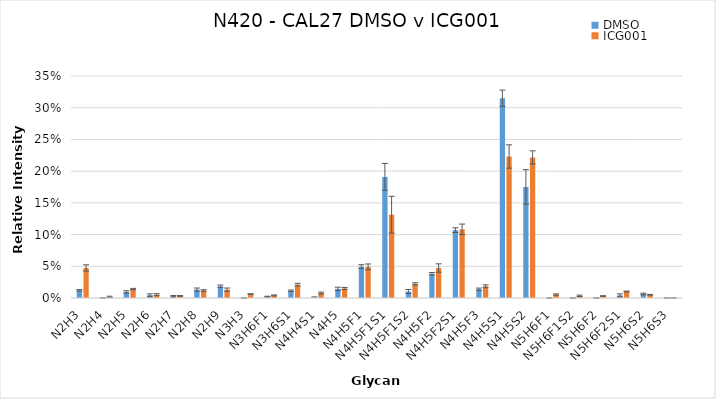
| Category | DMSO | ICG001 |
|---|---|---|
| N2H3 | 0.012 | 0.047 |
| N2H4 | 0 | 0.002 |
| N2H5 | 0.01 | 0.014 |
| N2H6 | 0.005 | 0.005 |
| N2H7 | 0.003 | 0.003 |
| N2H8 | 0.013 | 0.012 |
| N2H9 | 0.018 | 0.013 |
| N3H3 | 0 | 0.006 |
| N3H6F1 | 0.002 | 0.004 |
| N3H6S1 | 0.011 | 0.021 |
| N4H4S1 | 0.001 | 0.008 |
| N4H5 | 0.014 | 0.015 |
| N4H5F1 | 0.049 | 0.049 |
| N4H5F1S1 | 0.191 | 0.131 |
| N4H5F1S2 | 0.01 | 0.022 |
| N4H5F2 | 0.038 | 0.047 |
| N4H5F2S1 | 0.107 | 0.108 |
| N4H5F3 | 0.014 | 0.018 |
| N4H5S1 | 0.315 | 0.223 |
| N4H5S2 | 0.175 | 0.222 |
| N5H6F1 | 0 | 0.005 |
| N5H6F1S2 | 0 | 0.003 |
| N5H6F2 | 0 | 0.003 |
| N5H6F2S1 | 0.004 | 0.01 |
| N5H6S2 | 0.006 | 0.005 |
| N5H6S3 | 0 | 0 |